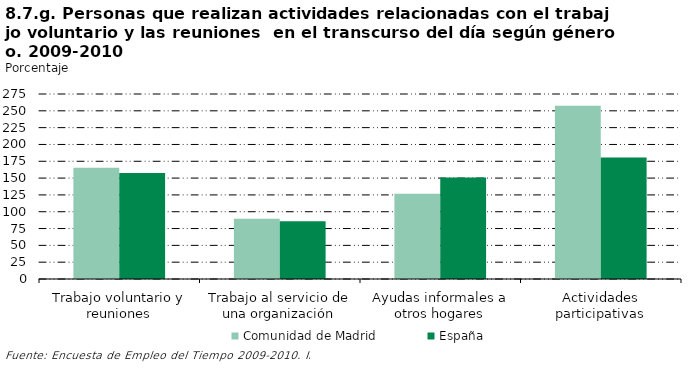
| Category | Comunidad de Madrid | España |
|---|---|---|
| Trabajo voluntario y reuniones | 165.455 | 157.447 |
| Trabajo al servicio de una organización | 89.627 | 85.714 |
| Ayudas informales a otros hogares | 126.691 | 150.877 |
| Actividades participativas | 257.612 | 180.556 |